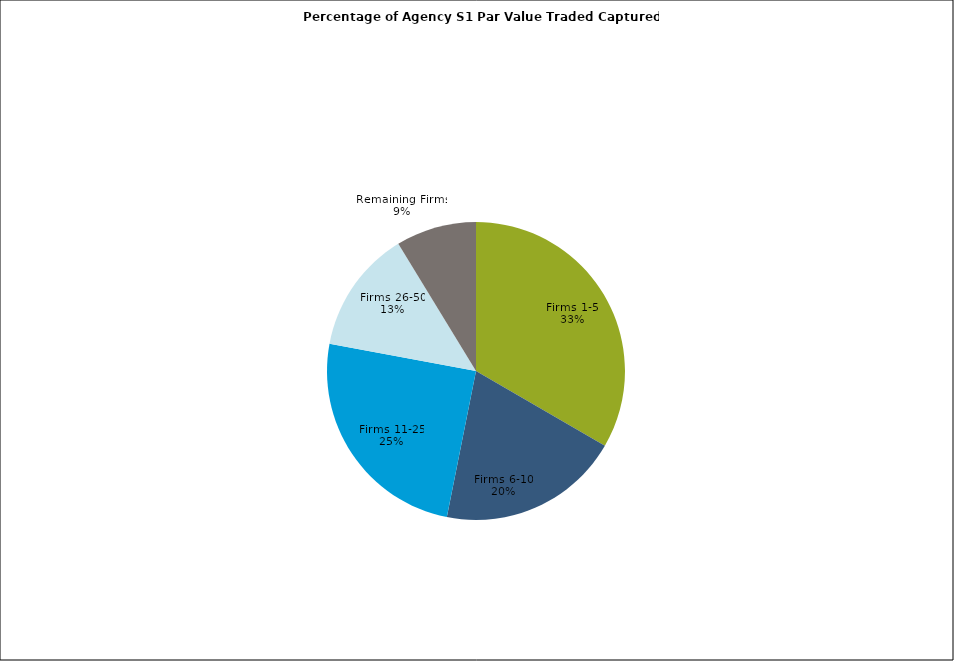
| Category | Series 0 |
|---|---|
| Firms 1-5 | 0.334 |
| Firms 6-10 | 0.198 |
| Firms 11-25 | 0.248 |
| Firms 26-50 | 0.133 |
| Remaining Firms | 0.087 |